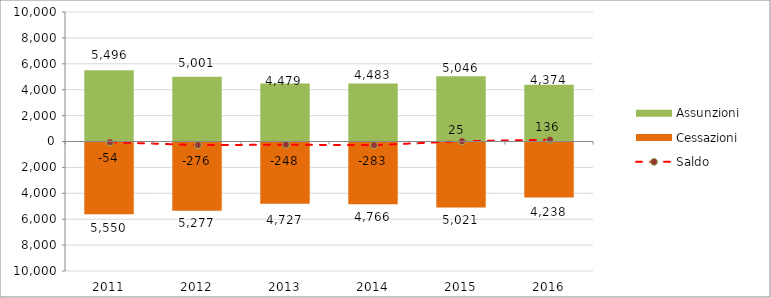
| Category | Assunzioni | Cessazioni |
|---|---|---|
| 2011.0 | 5496 | -5550 |
| 2012.0 | 5001 | -5277 |
| 2013.0 | 4479 | -4727 |
| 2014.0 | 4483 | -4766 |
| 2015.0 | 5046 | -5021 |
| 2016.0 | 4374 | -4238 |